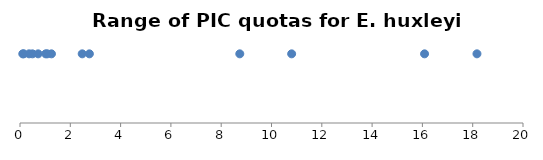
| Category | Range of PIC quotas for E. huxleyi strains |
|---|---|
| 0.360000000000001 | 1 |
| 0.493827160493826 | 1 |
| 16.08602150537634 | 1 |
| 2.758620689655171 | 1 |
| 1.250601250601251 | 1 |
| 10.80128205128205 | 1 |
| 0.110650069156293 | 1 |
| 1.023965141612201 | 1 |
| 18.16925734024179 | 1 |
| 8.739290085679313 | 1 |
| 1.083890126206384 | 1 |
| 0.14814814814815 | 1 |
| 2.472989195678272 | 1 |
| 0.720238095238095 | 1 |